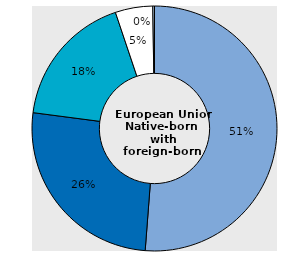
| Category | Series 1 |
|---|---|
| Europe | 51.214 |
| Africa | 25.853 |
| Asia | 17.768 |
| Latin America | 4.948 |
| North America and Oceania | 0.217 |